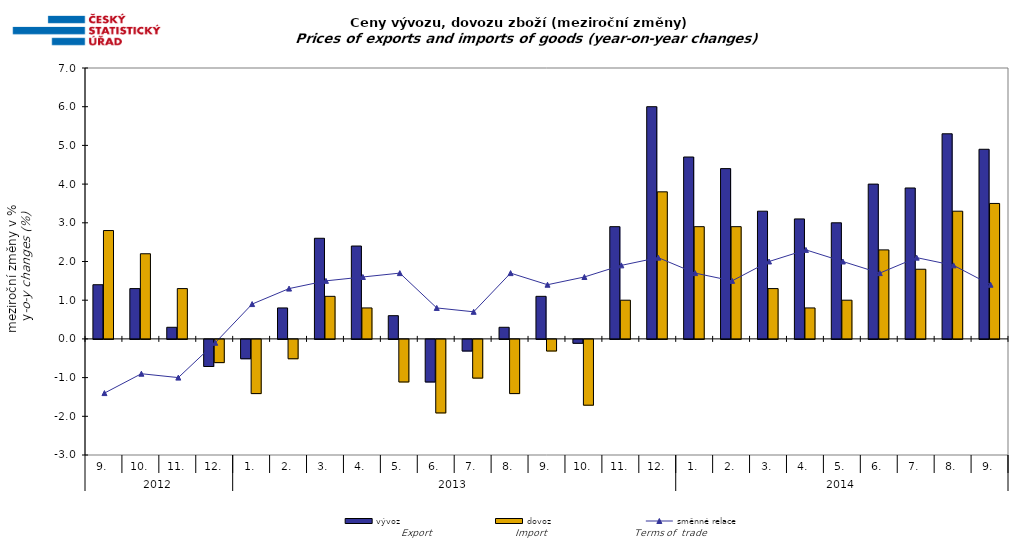
| Category | vývoz | dovoz |
|---|---|---|
| 0 | 1.4 | 2.8 |
| 1 | 1.3 | 2.2 |
| 2 | 0.3 | 1.3 |
| 3 | -0.7 | -0.6 |
| 4 | -0.5 | -1.4 |
| 5 | 0.8 | -0.5 |
| 6 | 2.6 | 1.1 |
| 7 | 2.4 | 0.8 |
| 8 | 0.6 | -1.1 |
| 9 | -1.1 | -1.9 |
| 10 | -0.3 | -1 |
| 11 | 0.3 | -1.4 |
| 12 | 1.1 | -0.3 |
| 13 | -0.1 | -1.7 |
| 14 | 2.9 | 1 |
| 15 | 6 | 3.8 |
| 16 | 4.7 | 2.9 |
| 17 | 4.4 | 2.9 |
| 18 | 3.3 | 1.3 |
| 19 | 3.1 | 0.8 |
| 20 | 3 | 1 |
| 21 | 4 | 2.3 |
| 22 | 3.9 | 1.8 |
| 23 | 5.3 | 3.3 |
| 24 | 4.9 | 3.5 |